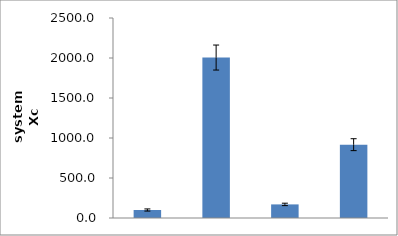
| Category | Series 0 |
|---|---|
| 0 | 100 |
| 1 | 2005.609 |
| 2 | 169.987 |
| 3 | 916.633 |